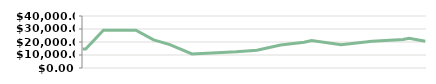
| Category | MONTH   |
|---|---|
| 2013-04-23 | 14600 |
| 2013-04-25 | 14600 |
| 2013-05-07 | 29000 |
| 2013-05-14 | 29000 |
| 2013-05-14 | 29000 |
| 2013-05-29 | 29000 |
| 2013-06-10 | 21600 |
| 2013-06-21 | 17950 |
| 2013-07-06 | 10776.471 |
| 2013-08-05 | 12455.862 |
| 2013-08-19 | 13667.568 |
| 2013-09-04 | 17651.667 |
| 2013-09-20 | 19877.912 |
| 2013-09-25 | 21138.05 |
| 2013-10-15 | 17951.744 |
| 2013-11-05 | 20556.13 |
| 2013-11-26 | 21997.139 |
| 2013-11-30 | 22917.635 |
| 2013-12-11 | 20504.315 |